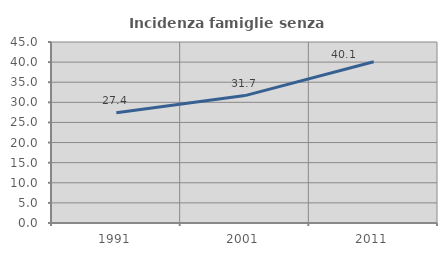
| Category | Incidenza famiglie senza nuclei |
|---|---|
| 1991.0 | 27.431 |
| 2001.0 | 31.676 |
| 2011.0 | 40.1 |